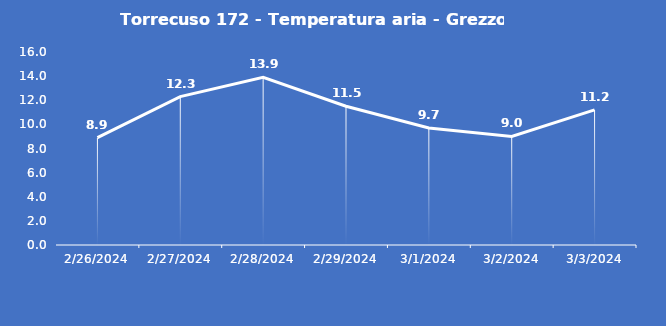
| Category | Torrecuso 172 - Temperatura aria - Grezzo (°C) |
|---|---|
| 2/26/24 | 8.9 |
| 2/27/24 | 12.3 |
| 2/28/24 | 13.9 |
| 2/29/24 | 11.5 |
| 3/1/24 | 9.7 |
| 3/2/24 | 9 |
| 3/3/24 | 11.2 |